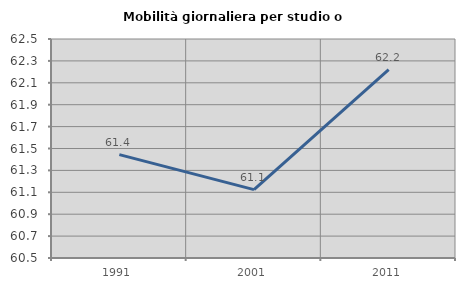
| Category | Mobilità giornaliera per studio o lavoro |
|---|---|
| 1991.0 | 61.444 |
| 2001.0 | 61.125 |
| 2011.0 | 62.221 |